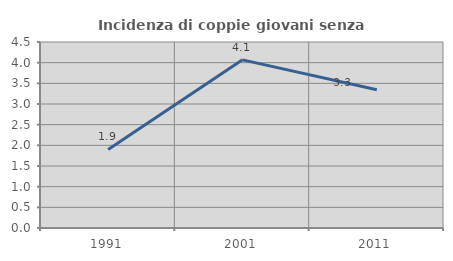
| Category | Incidenza di coppie giovani senza figli |
|---|---|
| 1991.0 | 1.901 |
| 2001.0 | 4.068 |
| 2011.0 | 3.344 |